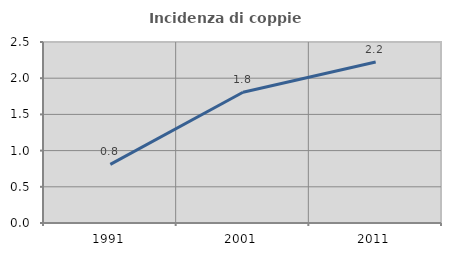
| Category | Incidenza di coppie miste |
|---|---|
| 1991.0 | 0.809 |
| 2001.0 | 1.806 |
| 2011.0 | 2.224 |